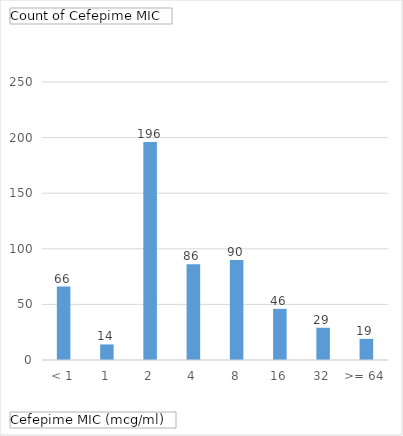
| Category | Total |
|---|---|
| < 1 | 66 |
| 1 | 14 |
| 2 | 196 |
| 4 | 86 |
| 8 | 90 |
| 16 | 46 |
| 32 | 29 |
| >= 64 | 19 |